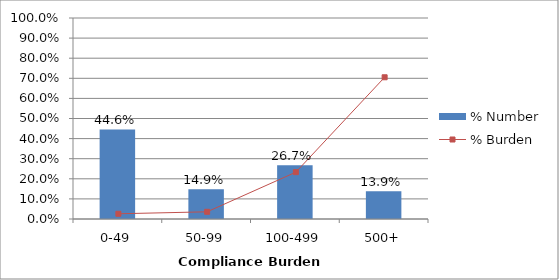
| Category | % Number |
|---|---|
| 0-49 | 0.446 |
| 50-99 | 0.149 |
| 100-499 | 0.267 |
| 500+ | 0.139 |